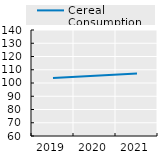
| Category | Cereal Consumption |
|---|---|
| 2019.0 | 103.866 |
| 2020.0 | 105.557 |
| 2021.0 | 107.255 |